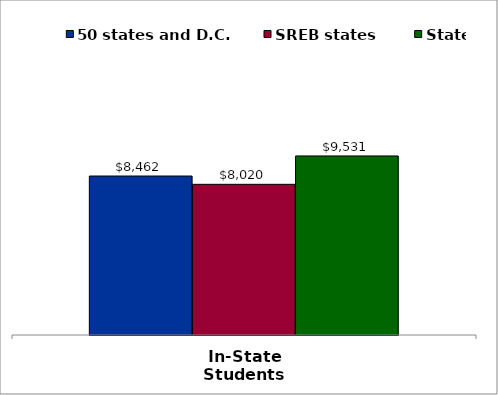
| Category | 50 states and D.C. | SREB states | State |
|---|---|---|---|
| In-State Students | 8462 | 8020 | 9530.5 |